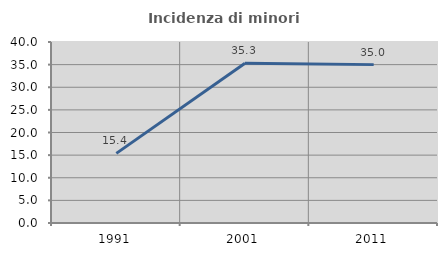
| Category | Incidenza di minori stranieri |
|---|---|
| 1991.0 | 15.385 |
| 2001.0 | 35.294 |
| 2011.0 | 35 |